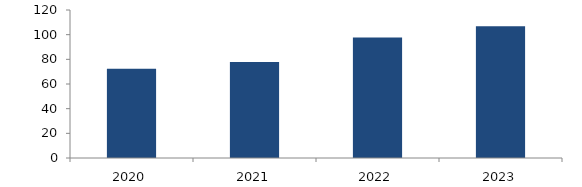
| Category | Bogotá |
|---|---|
| 2020.0 | 72.407 |
| 2021.0 | 77.885 |
| 2022.0 | 97.63 |
| 2023.0 | 106.771 |